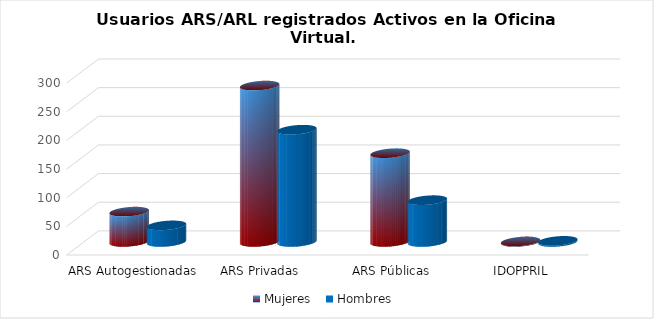
| Category | Mujeres | Hombres |
|---|---|---|
| ARS Autogestionadas | 53 | 29 |
| ARS Privadas | 273 | 196 |
| ARS Públicas | 155 | 73 |
| IDOPPRIL | 1 | 2 |